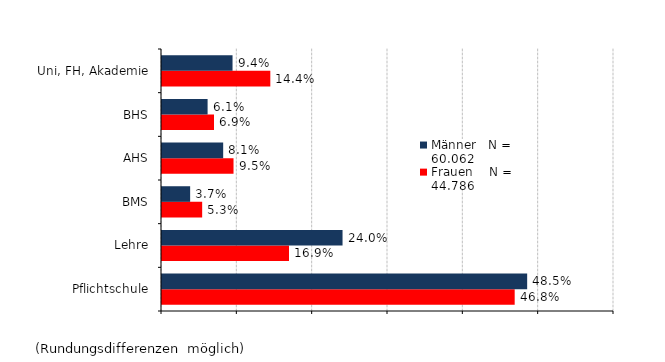
| Category | Frauen    N = 44.786 | Männer   N = 60.062 |
|---|---|---|
| Pflichtschule | 0.468 | 0.485 |
| Lehre | 0.169 | 0.24 |
| BMS | 0.053 | 0.037 |
| AHS | 0.095 | 0.081 |
| BHS | 0.069 | 0.061 |
| Uni, FH, Akademie | 0.144 | 0.094 |